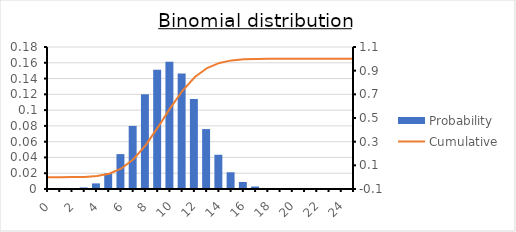
| Category | Probability |
|---|---|
| 0.0 | 0 |
| 1.0 | 0 |
| 2.0 | 0 |
| 3.0 | 0.002 |
| 4.0 | 0.007 |
| 5.0 | 0.02 |
| 6.0 | 0.044 |
| 7.0 | 0.08 |
| 8.0 | 0.12 |
| 9.0 | 0.151 |
| 10.0 | 0.161 |
| 11.0 | 0.147 |
| 12.0 | 0.114 |
| 13.0 | 0.076 |
| 14.0 | 0.043 |
| 15.0 | 0.021 |
| 16.0 | 0.009 |
| 17.0 | 0.003 |
| 18.0 | 0.001 |
| 19.0 | 0 |
| 20.0 | 0 |
| 21.0 | 0 |
| 22.0 | 0 |
| 23.0 | 0 |
| 24.0 | 0 |
| 25.0 | 0 |